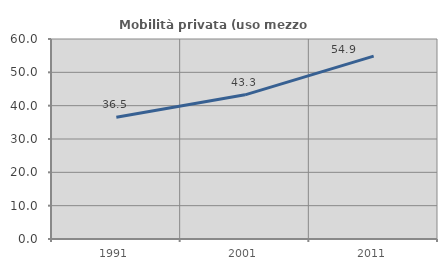
| Category | Mobilità privata (uso mezzo privato) |
|---|---|
| 1991.0 | 36.517 |
| 2001.0 | 43.253 |
| 2011.0 | 54.878 |